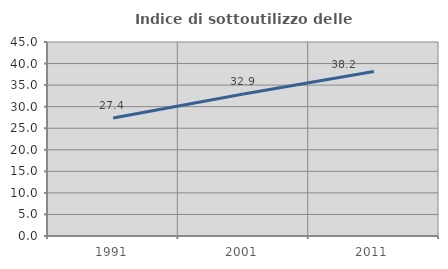
| Category | Indice di sottoutilizzo delle abitazioni  |
|---|---|
| 1991.0 | 27.374 |
| 2001.0 | 32.938 |
| 2011.0 | 38.179 |